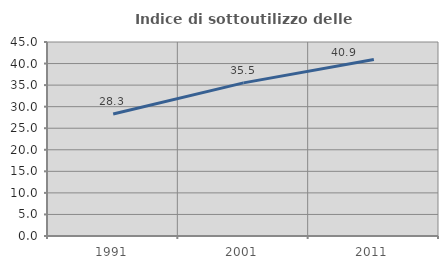
| Category | Indice di sottoutilizzo delle abitazioni  |
|---|---|
| 1991.0 | 28.318 |
| 2001.0 | 35.514 |
| 2011.0 | 40.95 |